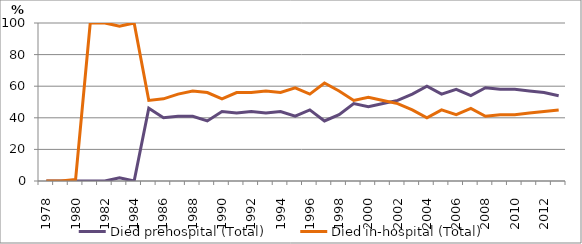
| Category | Died prehospital (Total) | Died in-hospital (Total) |
|---|---|---|
| 1978.0 | 0 | 0 |
| 1979.0 | 0 | 0 |
| 1980.0 | 0 | 1 |
| 1981.0 | 0 | 100 |
| 1982.0 | 0 | 100 |
| 1983.0 | 2 | 98 |
| 1984.0 | 0 | 100 |
| 1985.0 | 46 | 51 |
| 1986.0 | 40 | 52 |
| 1987.0 | 41 | 55 |
| 1988.0 | 41 | 57 |
| 1989.0 | 38 | 56 |
| 1990.0 | 44 | 52 |
| 1991.0 | 43 | 56 |
| 1992.0 | 44 | 56 |
| 1993.0 | 43 | 57 |
| 1994.0 | 44 | 56 |
| 1995.0 | 41 | 59 |
| 1996.0 | 45 | 55 |
| 1997.0 | 38 | 62 |
| 1998.0 | 42 | 57 |
| 1999.0 | 49 | 51 |
| 2000.0 | 47 | 53 |
| 2001.0 | 49 | 51 |
| 2002.0 | 51 | 49 |
| 2003.0 | 55 | 45 |
| 2004.0 | 60 | 40 |
| 2005.0 | 55 | 45 |
| 2006.0 | 58 | 42 |
| 2007.0 | 54 | 46 |
| 2008.0 | 59 | 41 |
| 2009.0 | 58 | 42 |
| 2010.0 | 58 | 42 |
| 2011.0 | 57 | 43 |
| 2012.0 | 56 | 44 |
| 2013.0 | 54 | 45 |